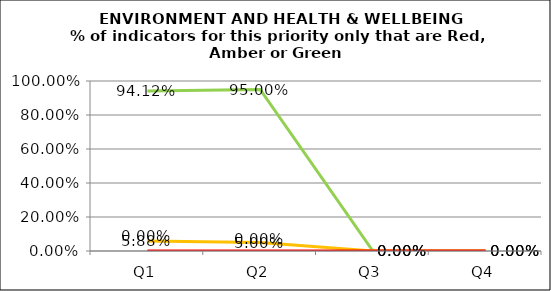
| Category | Green | Amber | Red |
|---|---|---|---|
| Q1 | 0.941 | 0.059 | 0 |
| Q2 | 0.95 | 0.05 | 0 |
| Q3 | 0 | 0 | 0 |
| Q4 | 0 | 0 | 0 |